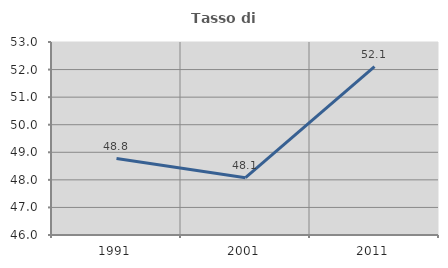
| Category | Tasso di occupazione   |
|---|---|
| 1991.0 | 48.771 |
| 2001.0 | 48.08 |
| 2011.0 | 52.105 |